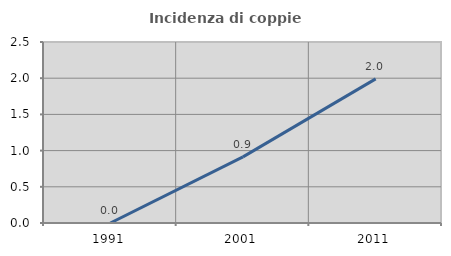
| Category | Incidenza di coppie miste |
|---|---|
| 1991.0 | 0 |
| 2001.0 | 0.913 |
| 2011.0 | 1.991 |